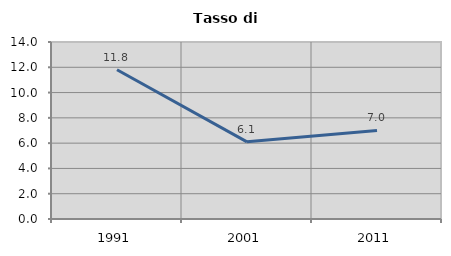
| Category | Tasso di disoccupazione   |
|---|---|
| 1991.0 | 11.81 |
| 2001.0 | 6.105 |
| 2011.0 | 7.009 |